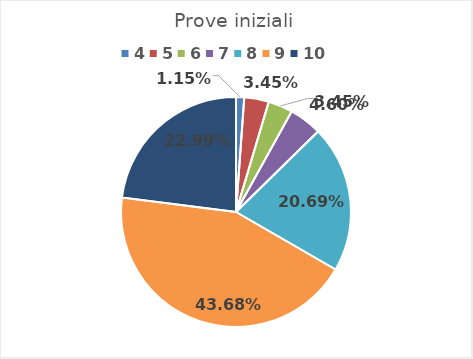
| Category | Series 0 |
|---|---|
| 4.0 | 0.011 |
| 5.0 | 0.034 |
| 6.0 | 0.034 |
| 7.0 | 0.046 |
| 8.0 | 0.207 |
| 9.0 | 0.437 |
| 10.0 | 0.23 |